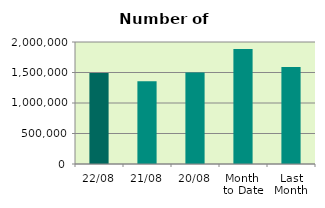
| Category | Series 0 |
|---|---|
| 22/08 | 1491500 |
| 21/08 | 1357482 |
| 20/08 | 1499894 |
| Month 
to Date | 1886704.625 |
| Last
Month | 1591495.826 |